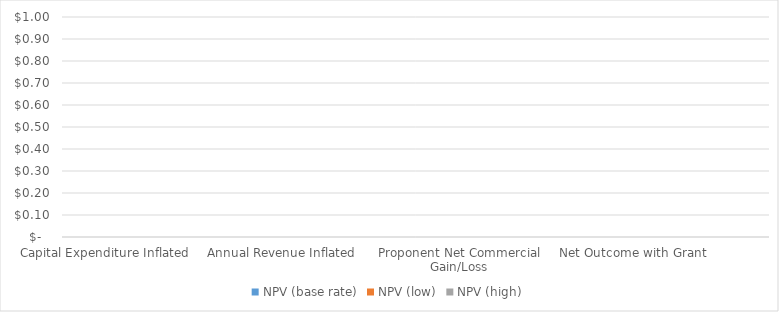
| Category |  NPV (base rate)  |  NPV (low)  |  NPV (high)  |
|---|---|---|---|
| Capital Expenditure Inflated | 0 | 0 | 0 |
| Operating & Maintenance Cost Inflated | 0 | 0 | 0 |
| Annual Revenue Inflated | 0 | 0 | 0 |
| Net Outcome | 0 | 0 | 0 |
| Proponent Net Commercial Gain/Loss | 0 | 0 | 0 |
| Grant Funding | 0 | 0 | 0 |
| Net Outcome with Grant  | 0 | 0 | 0 |
| Residual Value of Asset | 0 | 0 | 0 |